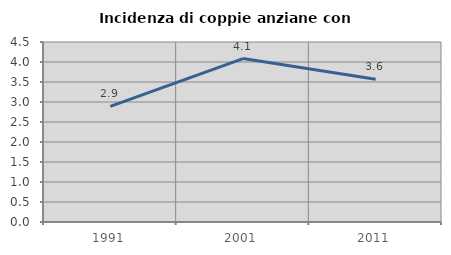
| Category | Incidenza di coppie anziane con figli |
|---|---|
| 1991.0 | 2.893 |
| 2001.0 | 4.086 |
| 2011.0 | 3.571 |